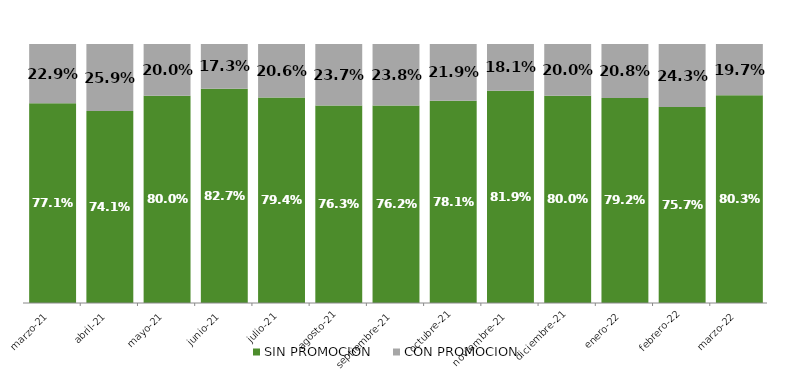
| Category | SIN PROMOCION   | CON PROMOCION   |
|---|---|---|
| 2021-03-01 | 0.771 | 0.229 |
| 2021-04-01 | 0.741 | 0.259 |
| 2021-05-01 | 0.8 | 0.2 |
| 2021-06-01 | 0.827 | 0.173 |
| 2021-07-01 | 0.794 | 0.206 |
| 2021-08-01 | 0.763 | 0.237 |
| 2021-09-01 | 0.762 | 0.238 |
| 2021-10-01 | 0.781 | 0.219 |
| 2021-11-01 | 0.819 | 0.181 |
| 2021-12-01 | 0.8 | 0.2 |
| 2022-01-01 | 0.792 | 0.208 |
| 2022-02-01 | 0.757 | 0.243 |
| 2022-03-01 | 0.803 | 0.197 |